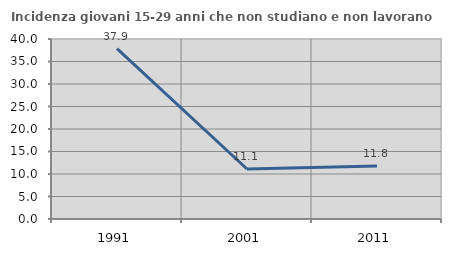
| Category | Incidenza giovani 15-29 anni che non studiano e non lavorano  |
|---|---|
| 1991.0 | 37.868 |
| 2001.0 | 11.111 |
| 2011.0 | 11.765 |